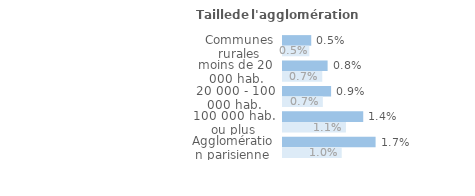
| Category | Series 1 | Series 0 |
|---|---|---|
| Communes rurales | 0.005 | 0.005 |
| moins de 20 000 hab. | 0.008 | 0.007 |
| 20 000 - 100 000 hab. | 0.009 | 0.007 |
| 100 000 hab. ou plus | 0.014 | 0.011 |
| Agglomération parisienne | 0.017 | 0.01 |